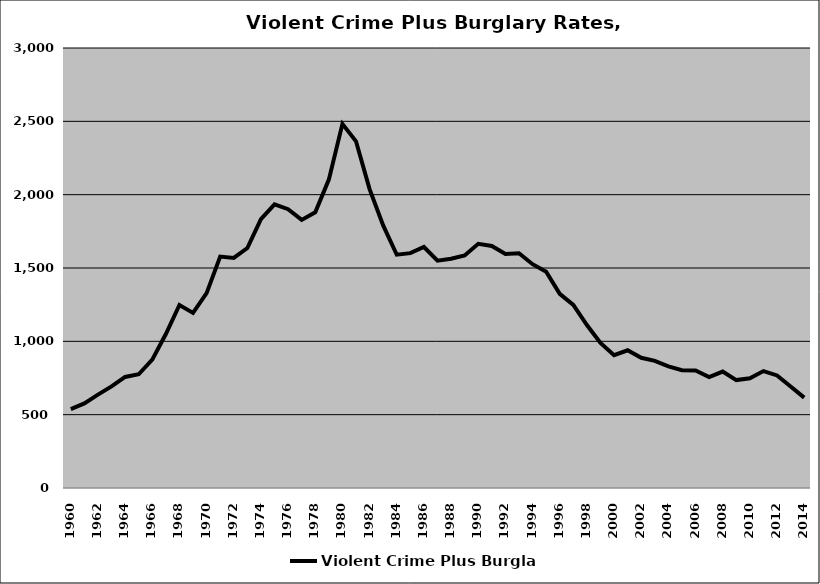
| Category | Violent Crime Plus Burglary |
|---|---|
| 1960.0 | 537.847 |
| 1961.0 | 576.73 |
| 1962.0 | 636.381 |
| 1963.0 | 693.076 |
| 1964.0 | 757.243 |
| 1965.0 | 775.539 |
| 1966.0 | 874.804 |
| 1967.0 | 1049.907 |
| 1968.0 | 1247.98 |
| 1969.0 | 1194.026 |
| 1970.0 | 1328.541 |
| 1971.0 | 1577.548 |
| 1972.0 | 1568.59 |
| 1973.0 | 1636.381 |
| 1974.0 | 1832.769 |
| 1975.0 | 1934.158 |
| 1976.0 | 1900.941 |
| 1977.0 | 1827.821 |
| 1978.0 | 1879.719 |
| 1979.0 | 2102.673 |
| 1980.0 | 2482.551 |
| 1981.0 | 2363.843 |
| 1982.0 | 2038.088 |
| 1983.0 | 1790.238 |
| 1984.0 | 1590.552 |
| 1985.0 | 1601.362 |
| 1986.0 | 1643.281 |
| 1987.0 | 1549.778 |
| 1988.0 | 1563.057 |
| 1989.0 | 1585.561 |
| 1990.0 | 1664.707 |
| 1991.0 | 1650.49 |
| 1992.0 | 1595.237 |
| 1993.0 | 1600.812 |
| 1994.0 | 1526.037 |
| 1995.0 | 1474.953 |
| 1996.0 | 1323.46 |
| 1997.0 | 1248.814 |
| 1998.0 | 1111.263 |
| 1999.0 | 988.996 |
| 2000.0 | 905.857 |
| 2001.0 | 938.843 |
| 2002.0 | 888.032 |
| 2003.0 | 867.177 |
| 2004.0 | 828.689 |
| 2005.0 | 803.146 |
| 2006.0 | 801.404 |
| 2007.0 | 756.362 |
| 2008.0 | 793.603 |
| 2009.0 | 735.644 |
| 2010.0 | 748.269 |
| 2011.0 | 797.315 |
| 2012.0 | 767.557 |
| 2013.0 | 691.589 |
| 2014.0 | 615.965 |